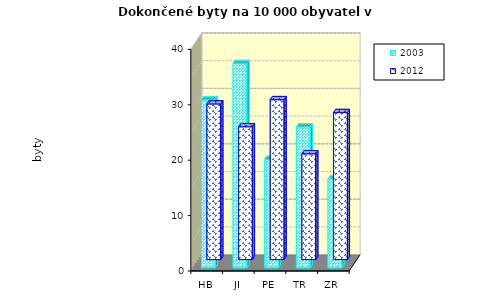
| Category | 2003 | 2012 |
|---|---|---|
| HB | 30.28 | 28.091 |
| JI | 36.855 | 23.967 |
| PE | 19.561 | 28.853 |
| TR | 25.397 | 19.089 |
| ZR | 16.001 | 26.526 |